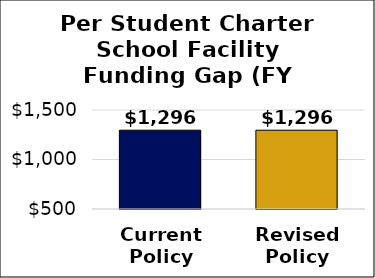
| Category | Per Student Facility Funding Gap |
|---|---|
| Current
Policy | 1295.807 |
| Revised
Policy | 1295.807 |